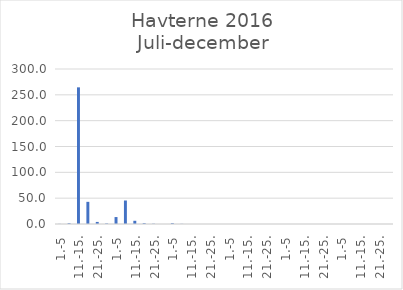
| Category | Series 0 |
|---|---|
| 1.-5 | 0.24 |
| 6.-10. | 1.445 |
| 11.-15. | 264.5 |
| 16.-20. | 42.892 |
| 21.-25. | 4.022 |
| 26.-31. | 1.005 |
| 1.-5 | 13.453 |
| 6.-10. | 45.479 |
| 11.-15. | 6.228 |
| 16.-20. | 1.575 |
| 21.-25. | 0.539 |
| 26.-31. | 0 |
| 1.-5 | 1.53 |
| 6.-10. | 0.279 |
| 11.-15. | 0 |
| 16.-20. | 0 |
| 21.-25. | 0 |
| 26.-30. | 0.022 |
| 1.-5 | 0 |
| 6.-10. | 0 |
| 11.-15. | 0 |
| 16.-20. | 0 |
| 21.-25. | 0 |
| 26.-31. | 0 |
| 1.-5 | 0 |
| 6.-10. | 0 |
| 11.-15. | 0 |
| 16.-20. | 0 |
| 21.-25. | 0 |
| 26.-30. | 0 |
| 1.-5 | 0 |
| 6.-10. | 0 |
| 11.-15. | 0 |
| 16.-20. | 0 |
| 21.-25. | 0 |
| 26.-31. | 0 |